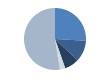
| Category | Series 0 |
|---|---|
| 0 | 395 |
| 1 | 170 |
| 2 | 116 |
| 3 | 43 |
| 4 | 801 |